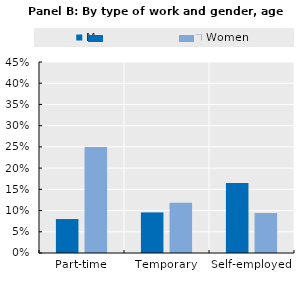
| Category | Men | Women |
|---|---|---|
| Part-time | 0.08 | 0.25 |
| Temporary | 0.096 | 0.119 |
| Self-employed | 0.165 | 0.094 |